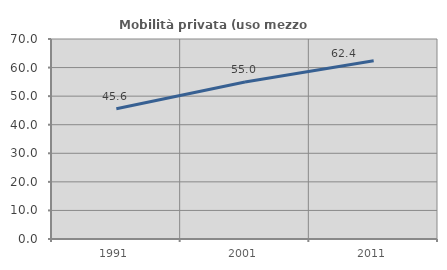
| Category | Mobilità privata (uso mezzo privato) |
|---|---|
| 1991.0 | 45.611 |
| 2001.0 | 54.979 |
| 2011.0 | 62.36 |